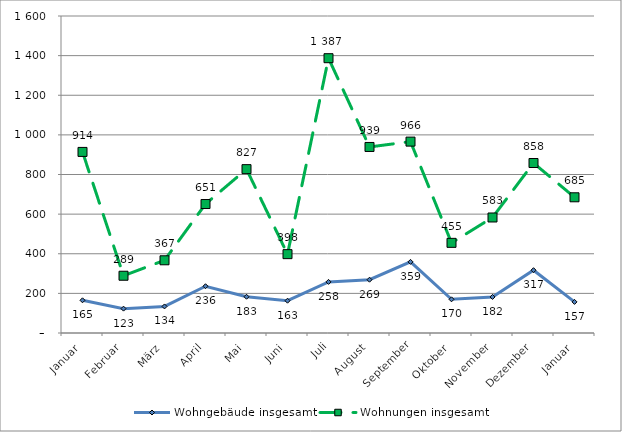
| Category | Wohngebäude insgesamt | Wohnungen insgesamt |
|---|---|---|
| Januar | 165 | 914 |
| Februar | 123 | 289 |
| März | 134 | 367 |
| April | 236 | 651 |
| Mai | 183 | 827 |
| Juni | 163 | 398 |
| Juli | 258 | 1387 |
| August | 269 | 939 |
| September | 359 | 966 |
| Oktober | 170 | 455 |
| November | 182 | 583 |
| Dezember | 317 | 858 |
| Januar | 157 | 685 |